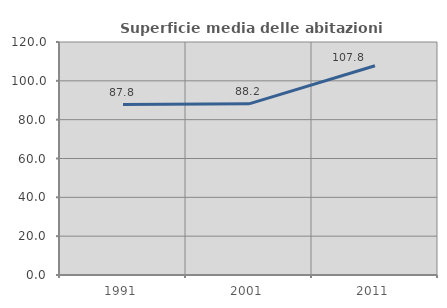
| Category | Superficie media delle abitazioni occupate |
|---|---|
| 1991.0 | 87.751 |
| 2001.0 | 88.158 |
| 2011.0 | 107.794 |